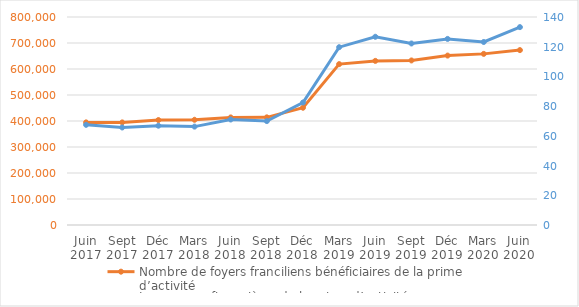
| Category | Nombre de foyers franciliens bénéficiaires de la prime d’activité  |
|---|---|
| Juin 2017 | 394705 |
| Sept 2017 | 394583 |
| Déc 2017 | 403596 |
| Mars 2018 | 404705 |
| Juin 2018 | 413711 |
| Sept 2018 | 414061 |
| Déc 2018 | 451065 |
| Mars 2019 | 618744 |
| Juin 2019 | 631190 |
| Sept 2019 | 632905 |
| Déc 2019 | 651627 |
| Mars 2020 | 658165 |
| Juin 2020 | 672670 |